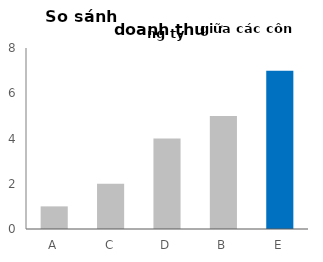
| Category | Doanh thu (tỷ đồng) |
|---|---|
| A | 1 |
| C | 2 |
| D | 4 |
| B | 5 |
| E | 7 |